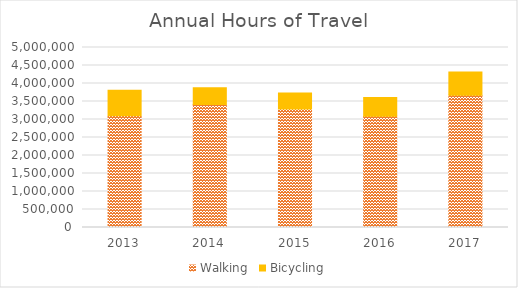
| Category | Walking | Bicycling |
|---|---|---|
| 2013 | 3101415.553 | 707809.859 |
| 2014 | 3416133.41 | 465712.089 |
| 2015 | 3292251.483 | 443448.526 |
| 2016 | 3087053.921 | 524279.901 |
| 2017 | 3674377.189 | 646233.822 |